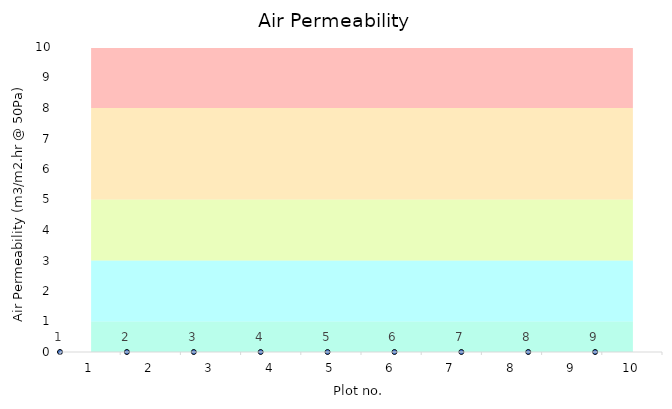
| Category | 0-1 | 0-3 | 3-5 | 5-8 | 8-10 |
|---|---|---|---|---|---|
| 1.0 | 1 | 2 | 2 | 3 | 2 |
| 2.0 | 1 | 2 | 2 | 3 | 2 |
| 3.0 | 1 | 2 | 2 | 3 | 2 |
| 4.0 | 1 | 2 | 2 | 3 | 2 |
| 5.0 | 1 | 2 | 2 | 3 | 2 |
| 6.0 | 1 | 2 | 2 | 3 | 2 |
| 7.0 | 1 | 2 | 2 | 3 | 2 |
| 8.0 | 1 | 2 | 2 | 3 | 2 |
| 9.0 | 1 | 2 | 2 | 3 | 2 |
| 10.0 | 1 | 2 | 2 | 3 | 2 |